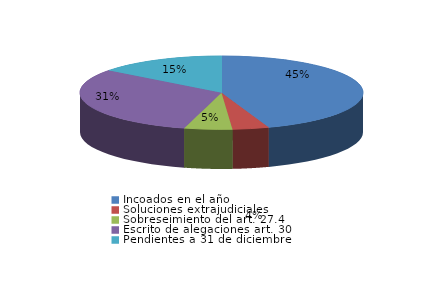
| Category | Series 0 |
|---|---|
| Incoados en el año | 1414 |
| Soluciones extrajudiciales | 132 |
| Sobreseimiento del art. 27.4 | 173 |
| Escrito de alegaciones art. 30 | 988 |
| Pendientes a 31 de diciembre | 463 |